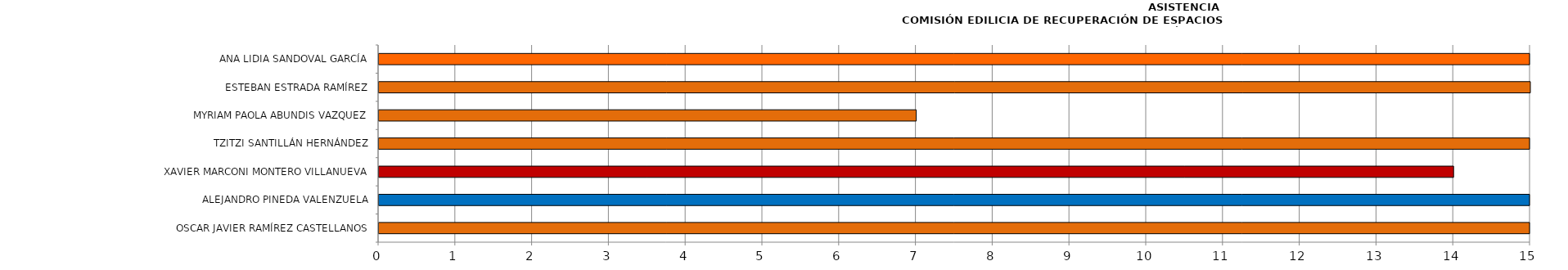
| Category | Series 0 |
|---|---|
| OSCAR JAVIER RAMÍREZ CASTELLANOS | 20 |
| ALEJANDRO PINEDA VALENZUELA | 18 |
| XAVIER MARCONI MONTERO VILLANUEVA | 14 |
| TZITZI SANTILLÁN HERNÁNDEZ | 19 |
| MYRIAM PAOLA ABUNDIS VAZQUEZ | 7 |
| ESTEBAN ESTRADA RAMÍREZ | 15 |
| ANA LIDIA SANDOVAL GARCÍA | 16 |